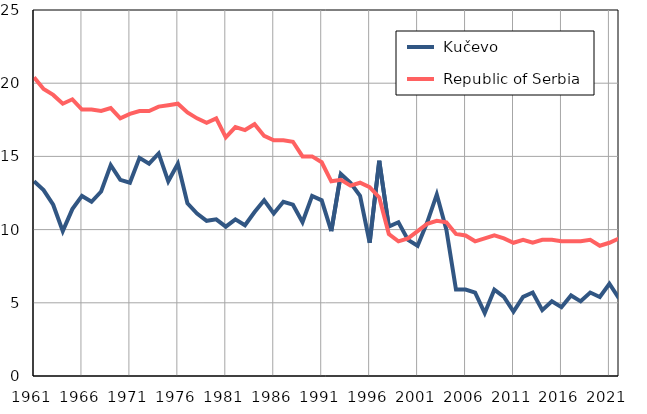
| Category |  Kučevo |  Republic of Serbia |
|---|---|---|
| 1961.0 | 13.3 | 20.4 |
| 1962.0 | 12.7 | 19.6 |
| 1963.0 | 11.7 | 19.2 |
| 1964.0 | 9.9 | 18.6 |
| 1965.0 | 11.4 | 18.9 |
| 1966.0 | 12.3 | 18.2 |
| 1967.0 | 11.9 | 18.2 |
| 1968.0 | 12.6 | 18.1 |
| 1969.0 | 14.4 | 18.3 |
| 1970.0 | 13.4 | 17.6 |
| 1971.0 | 13.2 | 17.9 |
| 1972.0 | 14.9 | 18.1 |
| 1973.0 | 14.5 | 18.1 |
| 1974.0 | 15.2 | 18.4 |
| 1975.0 | 13.3 | 18.5 |
| 1976.0 | 14.5 | 18.6 |
| 1977.0 | 11.8 | 18 |
| 1978.0 | 11.1 | 17.6 |
| 1979.0 | 10.6 | 17.3 |
| 1980.0 | 10.7 | 17.6 |
| 1981.0 | 10.2 | 16.3 |
| 1982.0 | 10.7 | 17 |
| 1983.0 | 10.3 | 16.8 |
| 1984.0 | 11.2 | 17.2 |
| 1985.0 | 12 | 16.4 |
| 1986.0 | 11.1 | 16.1 |
| 1987.0 | 11.9 | 16.1 |
| 1988.0 | 11.7 | 16 |
| 1989.0 | 10.5 | 15 |
| 1990.0 | 12.3 | 15 |
| 1991.0 | 12 | 14.6 |
| 1992.0 | 9.9 | 13.3 |
| 1993.0 | 13.8 | 13.4 |
| 1994.0 | 13.2 | 13 |
| 1995.0 | 12.3 | 13.2 |
| 1996.0 | 9.1 | 12.9 |
| 1997.0 | 14.7 | 12.2 |
| 1998.0 | 10.2 | 9.7 |
| 1999.0 | 10.5 | 9.2 |
| 2000.0 | 9.3 | 9.4 |
| 2001.0 | 8.9 | 9.9 |
| 2002.0 | 10.5 | 10.4 |
| 2003.0 | 12.4 | 10.6 |
| 2004.0 | 10 | 10.5 |
| 2005.0 | 5.9 | 9.7 |
| 2006.0 | 5.9 | 9.6 |
| 2007.0 | 5.7 | 9.2 |
| 2008.0 | 4.3 | 9.4 |
| 2009.0 | 5.9 | 9.6 |
| 2010.0 | 5.4 | 9.4 |
| 2011.0 | 4.4 | 9.1 |
| 2012.0 | 5.4 | 9.3 |
| 2013.0 | 5.7 | 9.1 |
| 2014.0 | 4.5 | 9.3 |
| 2015.0 | 5.1 | 9.3 |
| 2016.0 | 4.7 | 9.2 |
| 2017.0 | 5.5 | 9.2 |
| 2018.0 | 5.1 | 9.2 |
| 2019.0 | 5.7 | 9.3 |
| 2020.0 | 5.4 | 8.9 |
| 2021.0 | 6.3 | 9.1 |
| 2022.0 | 5.3 | 9.4 |